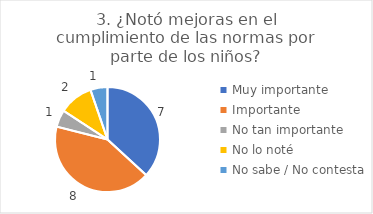
| Category | 3. ¿Notó mejoras en el cumplimiento de las normas por parte de los niños? |
|---|---|
| Muy importante  | 0.368 |
| Importante  | 0.421 |
| No tan importante  | 0.053 |
| No lo noté  | 0.105 |
| No sabe / No contesta | 0.053 |